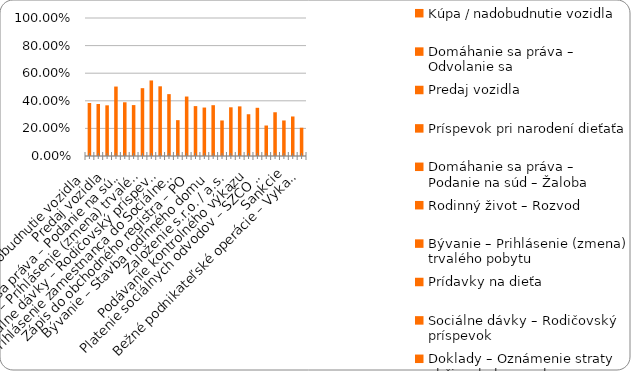
| Category | % |
|---|---|
| Kúpa / nadobudnutie vozidla | 0.384 |
| Domáhanie sa práva – Odvolanie sa | 0.377 |
| Predaj vozidla | 0.367 |
| Príspevok pri narodení dieťaťa | 0.503 |
| Domáhanie sa práva – Podanie na súd – Žaloba | 0.389 |
| Rodinný život – Rozvod | 0.369 |
| Bývanie – Prihlásenie (zmena) trvalého pobytu | 0.491 |
| Prídavky na dieťa | 0.547 |
| Sociálne dávky – Rodičovský príspevok | 0.505 |
| Doklady – Oznámenie straty občianskeho preukazu | 0.448 |
| Prihlásenie zamestnanca do Sociálnej poisťovne | 0.26 |
| Plnenie si daňových povinností – zamestnanec (FO) | 0.431 |
| Zápis do obchodného registra – PO | 0.362 |
| Živnosť - ukončenie | 0.351 |
| Bývanie – Stavba rodinného domu | 0.368 |
| Sociálne dávky – Príspevok v nezamestnanosti | 0.258 |
| Založenie s.r.o. / a.s. | 0.353 |
| Živnosť – založenie | 0.36 |
| Podávanie kontrolného výkazu | 0.303 |
| Plnenie si daňových povinností – SZČO / PO  | 0.349 |
| Platenie sociálnych odvodov – SZČO / PO | 0.221 |
| Živnosť - prerušenie | 0.317 |
| Sankcie | 0.257 |
| Živnosť - zmena | 0.286 |
| Bežné podnikateľské operácie – Vykazovanie štatistík | 0.205 |